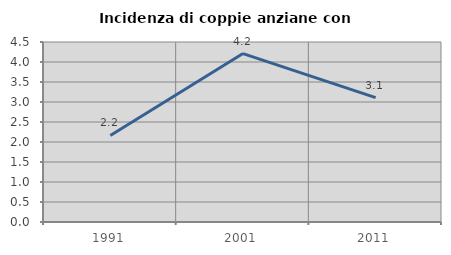
| Category | Incidenza di coppie anziane con figli |
|---|---|
| 1991.0 | 2.163 |
| 2001.0 | 4.211 |
| 2011.0 | 3.109 |